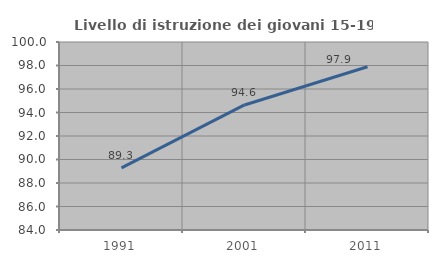
| Category | Livello di istruzione dei giovani 15-19 anni |
|---|---|
| 1991.0 | 89.286 |
| 2001.0 | 94.643 |
| 2011.0 | 97.895 |